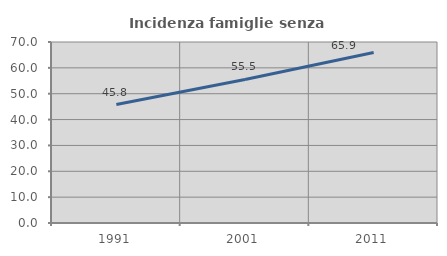
| Category | Incidenza famiglie senza nuclei |
|---|---|
| 1991.0 | 45.804 |
| 2001.0 | 55.515 |
| 2011.0 | 65.939 |